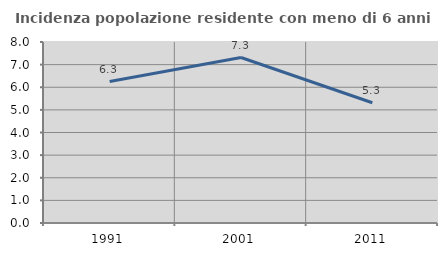
| Category | Incidenza popolazione residente con meno di 6 anni |
|---|---|
| 1991.0 | 6.25 |
| 2001.0 | 7.314 |
| 2011.0 | 5.317 |